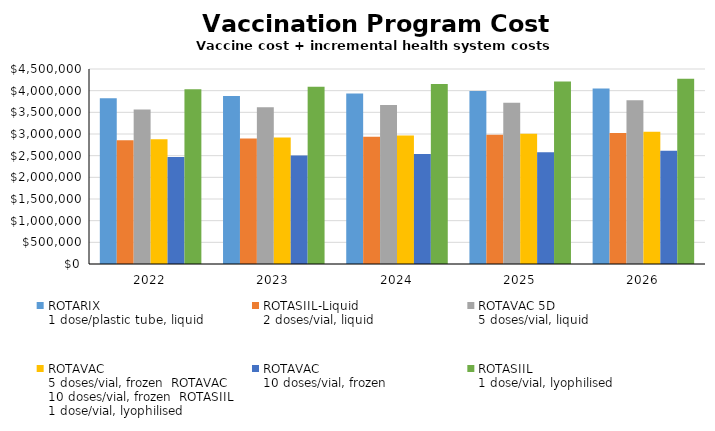
| Category | ROTARIX
1 dose/plastic tube, liquid | ROTASIIL-Liquid
2 doses/vial, liquid | ROTAVAC 5D
5 doses/vial, liquid | ROTAVAC
5 doses/vial, frozen ROTAVAC 
10 doses/vial, frozen ROTASIIL
1 dose/vial, lyophilised | ROTAVAC 
10 doses/vial, frozen | ROTASIIL
1 dose/vial, lyophilised |
|---|---|---|---|---|---|---|
| 2022.0 | 3822408.333 | 2854421.538 | 3564718.621 | 2879475.789 | 2468045.106 | 4034397.5 |
| 2023.0 | 3877973.553 | 2895915.421 | 3616537.882 | 2921333.878 | 2503922.349 | 4093044.344 |
| 2024.0 | 3934346.509 | 2938012.487 | 3669110.424 | 2963800.445 | 2540321.128 | 4152543.72 |
| 2025.0 | 3991538.941 | 2980721.506 | 3722447.198 | 3006884.336 | 2577249.025 | 4212908.02 |
| 2026.0 | 4049562.763 | 3024051.374 | 3776559.312 | 3050594.525 | 2614713.732 | 4274149.819 |